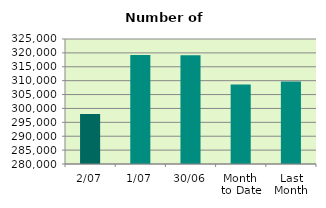
| Category | Series 0 |
|---|---|
| 2/07 | 298042 |
| 1/07 | 319210 |
| 30/06 | 319180 |
| Month 
to Date | 308626 |
| Last
Month | 309731.364 |